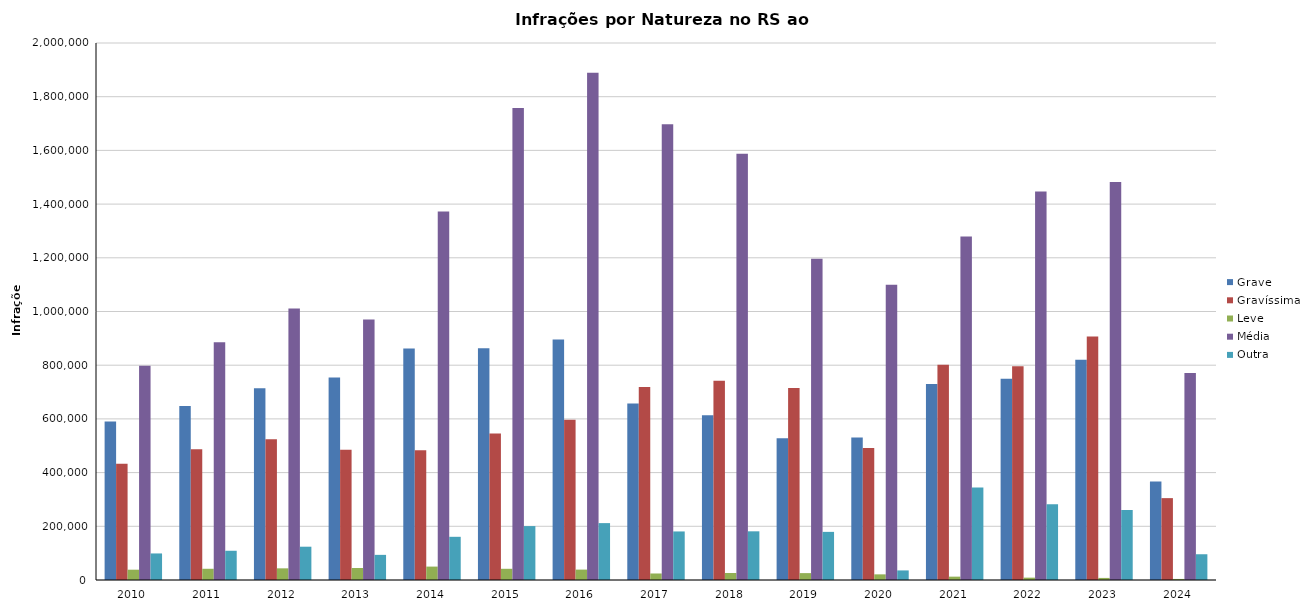
| Category | Grave | Gravíssima | Leve | Média | Outra |
|---|---|---|---|---|---|
| 2010 | 590635 | 433245 | 38364 | 797956 | 98896 |
| 2011 | 648357 | 487237 | 41788 | 885738 | 108898 |
| 2012 | 714266 | 524159 | 43448 | 1010936 | 124027 |
| 2013 | 754125 | 485385 | 44604 | 969862 | 93610 |
| 2014 | 861957 | 483173 | 49950 | 1372357 | 160878 |
| 2015 | 863489 | 545318 | 41743 | 1757983 | 200818 |
| 2016 | 895443 | 596944 | 38728 | 1889336 | 211874 |
| 2017 | 656979 | 719188 | 24263 | 1697032 | 180809 |
| 2018 | 613998 | 742079 | 26000 | 1587076 | 181321 |
| 2019 | 527974 | 715287 | 25644 | 1196498 | 179246 |
| 2020 | 531166 | 491413 | 21031 | 1099715 | 35710 |
| 2021 | 730096 | 801674 | 12502 | 1278912 | 344296 |
| 2022 | 749400 | 796165 | 8775 | 1446954 | 282432 |
| 2023 | 820502 | 906566 | 7749 | 1482370 | 260761 |
| 2024 | 366836 | 304929 | 3926 | 770795 | 95903 |